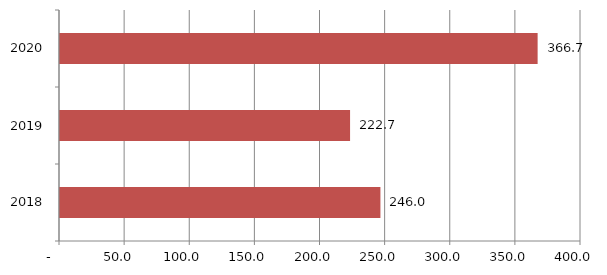
| Category | Series 0 |
|---|---|
| 2018.0 | 246 |
| 2019.0 | 222.7 |
| 2020.0 | 366.7 |